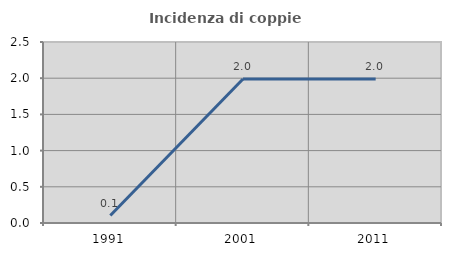
| Category | Incidenza di coppie miste |
|---|---|
| 1991.0 | 0.103 |
| 2001.0 | 1.988 |
| 2011.0 | 1.988 |